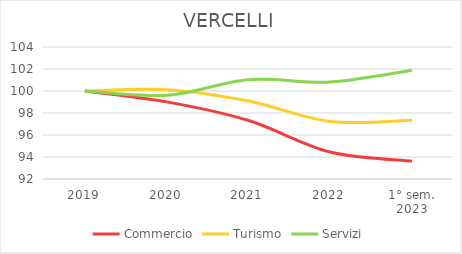
| Category | Commercio | Turismo | Servizi |
|---|---|---|---|
| 2019 | 100 | 100 | 100 |
| 2020 | 99.01 | 100.121 | 99.607 |
| 2021 | 97.318 | 99.094 | 101.032 |
| 2022 | 94.45 | 97.222 | 100.811 |
| 1° sem.
2023 | 93.625 | 97.343 | 101.892 |